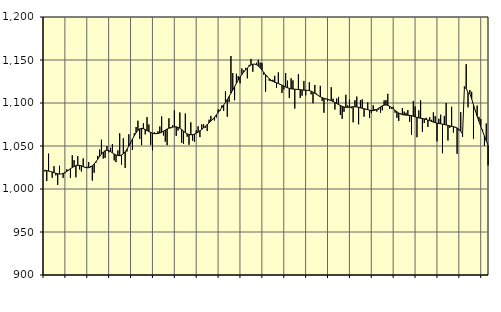
| Category | Piggar | Series 1 |
|---|---|---|
| nan | 1020.4 | 1022.06 |
| 1.0 | 1009.2 | 1021.32 |
| 1.0 | 1041.1 | 1020.83 |
| 1.0 | 1020.2 | 1020.38 |
| 1.0 | 1013.1 | 1019.77 |
| 1.0 | 1026.5 | 1019.11 |
| 1.0 | 1015.9 | 1018.29 |
| 1.0 | 1004.8 | 1017.75 |
| 1.0 | 1027 | 1017.39 |
| 1.0 | 1017.5 | 1017.51 |
| 1.0 | 1012.9 | 1018.12 |
| 1.0 | 1018.3 | 1019.17 |
| nan | 1022.9 | 1020.57 |
| 2.0 | 1021.6 | 1022.12 |
| 2.0 | 1012.8 | 1023.63 |
| 2.0 | 1039.2 | 1024.98 |
| 2.0 | 1033.5 | 1026.19 |
| 2.0 | 1013.6 | 1027.11 |
| 2.0 | 1038.2 | 1027.57 |
| 2.0 | 1022.7 | 1027.54 |
| 2.0 | 1020.4 | 1026.97 |
| 2.0 | 1035.6 | 1026.07 |
| 2.0 | 1024.5 | 1025.22 |
| 2.0 | 1026 | 1024.72 |
| nan | 1031.4 | 1024.78 |
| 3.0 | 1026.6 | 1025.52 |
| 3.0 | 1009.8 | 1026.97 |
| 3.0 | 1018.9 | 1029.09 |
| 3.0 | 1030.4 | 1031.74 |
| 3.0 | 1038.5 | 1034.75 |
| 3.0 | 1045.9 | 1037.85 |
| 3.0 | 1057.3 | 1040.69 |
| 3.0 | 1035.4 | 1042.93 |
| 3.0 | 1036.1 | 1044.4 |
| 3.0 | 1049.9 | 1044.96 |
| 3.0 | 1042.7 | 1044.61 |
| nan | 1047.9 | 1043.51 |
| 4.0 | 1052.2 | 1042.06 |
| 4.0 | 1033.2 | 1040.64 |
| 4.0 | 1031.2 | 1039.55 |
| 4.0 | 1044.9 | 1038.87 |
| 4.0 | 1064.7 | 1038.8 |
| 4.0 | 1028.4 | 1039.47 |
| 4.0 | 1058.9 | 1040.91 |
| 4.0 | 1024.5 | 1043.22 |
| 4.0 | 1043.5 | 1046.31 |
| 4.0 | 1063.6 | 1049.93 |
| 4.0 | 1052.3 | 1053.86 |
| nan | 1045.3 | 1057.98 |
| 5.0 | 1064.8 | 1061.93 |
| 5.0 | 1072.1 | 1065.41 |
| 5.0 | 1079.4 | 1068.15 |
| 5.0 | 1058.2 | 1069.9 |
| 5.0 | 1051 | 1070.49 |
| 5.0 | 1076.4 | 1070.14 |
| 5.0 | 1063.5 | 1069.18 |
| 5.0 | 1083.5 | 1067.98 |
| 5.0 | 1075 | 1066.82 |
| 5.0 | 1051.3 | 1065.77 |
| 5.0 | 1044.9 | 1064.94 |
| nan | 1066 | 1064.41 |
| 6.0 | 1065.1 | 1064.29 |
| 6.0 | 1067.2 | 1064.55 |
| 6.0 | 1072.7 | 1065.09 |
| 6.0 | 1084.4 | 1065.98 |
| 6.0 | 1062.2 | 1067.25 |
| 6.0 | 1055 | 1068.56 |
| 6.0 | 1051 | 1069.75 |
| 6.0 | 1082.2 | 1070.77 |
| 6.0 | 1070.5 | 1071.48 |
| 6.0 | 1074.2 | 1071.95 |
| 6.0 | 1091.4 | 1072.27 |
| nan | 1061.8 | 1072.28 |
| 7.0 | 1068 | 1071.75 |
| 7.0 | 1089 | 1070.7 |
| 7.0 | 1053.7 | 1069.16 |
| 7.0 | 1052.5 | 1067.31 |
| 7.0 | 1087.8 | 1065.48 |
| 7.0 | 1060.7 | 1064.09 |
| 7.0 | 1051.4 | 1063.3 |
| 7.0 | 1077.5 | 1063.04 |
| 7.0 | 1056.2 | 1063.22 |
| 7.0 | 1054.7 | 1063.84 |
| 7.0 | 1068.2 | 1064.83 |
| nan | 1072.9 | 1066.09 |
| 8.0 | 1060.3 | 1067.63 |
| 8.0 | 1075.1 | 1069.3 |
| 8.0 | 1075.2 | 1071.08 |
| 8.0 | 1071.2 | 1072.98 |
| 8.0 | 1067.4 | 1074.9 |
| 8.0 | 1080.6 | 1076.84 |
| 8.0 | 1085 | 1078.91 |
| 8.0 | 1080.2 | 1081.12 |
| 8.0 | 1079.6 | 1083.54 |
| 8.0 | 1083.1 | 1086.17 |
| 8.0 | 1092.7 | 1088.92 |
| nan | 1090.7 | 1091.75 |
| 9.0 | 1097.1 | 1094.65 |
| 9.0 | 1091 | 1097.65 |
| 9.0 | 1113.6 | 1100.73 |
| 9.0 | 1084.1 | 1104.05 |
| 9.0 | 1101.1 | 1107.62 |
| 9.0 | 1154.6 | 1111.34 |
| 9.0 | 1134.7 | 1115.16 |
| 9.0 | 1103.2 | 1119.02 |
| 9.0 | 1134 | 1122.87 |
| 9.0 | 1131.4 | 1126.59 |
| 9.0 | 1122.8 | 1130.04 |
| nan | 1140.1 | 1133.14 |
| 10.0 | 1137.8 | 1135.93 |
| 10.0 | 1140.8 | 1138.5 |
| 10.0 | 1128.7 | 1140.82 |
| 10.0 | 1144.3 | 1142.76 |
| 10.0 | 1151.3 | 1144.25 |
| 10.0 | 1136.4 | 1145.13 |
| 10.0 | 1145.3 | 1145.23 |
| 10.0 | 1146.8 | 1144.57 |
| 10.0 | 1150.2 | 1143.13 |
| 10.0 | 1147.1 | 1140.95 |
| 10.0 | 1146.5 | 1138.34 |
| nan | 1132.9 | 1135.58 |
| 11.0 | 1113.2 | 1132.86 |
| 11.0 | 1131.5 | 1130.35 |
| 11.0 | 1125.9 | 1128.26 |
| 11.0 | 1125.3 | 1126.58 |
| 11.0 | 1127 | 1125.19 |
| 11.0 | 1131.6 | 1124.16 |
| 11.0 | 1117.7 | 1123.41 |
| 11.0 | 1135.6 | 1122.65 |
| 11.0 | 1120.9 | 1121.78 |
| 11.0 | 1111.7 | 1120.8 |
| 11.0 | 1115.8 | 1119.69 |
| nan | 1134.9 | 1118.62 |
| 12.0 | 1126 | 1117.73 |
| 12.0 | 1105.9 | 1117.05 |
| 12.0 | 1128.7 | 1116.51 |
| 12.0 | 1126.3 | 1116.2 |
| 12.0 | 1093.5 | 1116.01 |
| 12.0 | 1115.3 | 1115.86 |
| 12.0 | 1133.4 | 1115.69 |
| 12.0 | 1105.9 | 1115.45 |
| 12.0 | 1108.5 | 1115.15 |
| 12.0 | 1125.6 | 1114.97 |
| 12.0 | 1108.9 | 1114.87 |
| nan | 1114.9 | 1114.73 |
| 13.0 | 1124.1 | 1114.4 |
| 13.0 | 1110 | 1113.71 |
| 13.0 | 1099.7 | 1112.65 |
| 13.0 | 1120.9 | 1111.32 |
| 13.0 | 1111 | 1109.91 |
| 13.0 | 1108.1 | 1108.53 |
| 13.0 | 1119.9 | 1107.24 |
| 13.0 | 1102.4 | 1106.19 |
| 13.0 | 1088.7 | 1105.51 |
| 13.0 | 1104.4 | 1104.96 |
| 13.0 | 1102.2 | 1104.36 |
| nan | 1103.2 | 1103.62 |
| 14.0 | 1118.3 | 1102.69 |
| 14.0 | 1105 | 1101.68 |
| 14.0 | 1092.4 | 1100.64 |
| 14.0 | 1105.2 | 1099.49 |
| 14.0 | 1107.1 | 1098.31 |
| 14.0 | 1086.1 | 1097.18 |
| 14.0 | 1081.6 | 1096.14 |
| 14.0 | 1089.7 | 1095.35 |
| 14.0 | 1109.6 | 1094.99 |
| 14.0 | 1097.3 | 1094.97 |
| 14.0 | 1104 | 1095.18 |
| nan | 1093.9 | 1095.48 |
| 15.0 | 1077.5 | 1095.67 |
| 15.0 | 1103.3 | 1095.62 |
| 15.0 | 1107.5 | 1095.37 |
| 15.0 | 1075.2 | 1094.95 |
| 15.0 | 1103.3 | 1094.4 |
| 15.0 | 1104.3 | 1093.84 |
| 15.0 | 1084.1 | 1093.35 |
| 15.0 | 1092.4 | 1092.85 |
| 15.0 | 1100.7 | 1092.23 |
| 15.0 | 1082.6 | 1091.59 |
| 15.0 | 1088.2 | 1091.17 |
| nan | 1097.4 | 1091.13 |
| 16.0 | 1092.9 | 1091.61 |
| 16.0 | 1090 | 1092.6 |
| 16.0 | 1092.1 | 1093.93 |
| 16.0 | 1088.7 | 1095.39 |
| 16.0 | 1091.4 | 1096.71 |
| 16.0 | 1103 | 1097.54 |
| 16.0 | 1103.4 | 1097.73 |
| 16.0 | 1110.7 | 1097.29 |
| 16.0 | 1093 | 1096.27 |
| 16.0 | 1093.3 | 1094.91 |
| 16.0 | 1095.5 | 1093.32 |
| nan | 1088.8 | 1091.54 |
| 17.0 | 1082.8 | 1089.84 |
| 17.0 | 1079.1 | 1088.4 |
| 17.0 | 1088.1 | 1087.24 |
| 17.0 | 1094.1 | 1086.45 |
| 17.0 | 1090 | 1086.06 |
| 17.0 | 1088.6 | 1085.89 |
| 17.0 | 1091.8 | 1085.78 |
| 17.0 | 1078.3 | 1085.58 |
| 17.0 | 1063.1 | 1085.22 |
| 17.0 | 1102.4 | 1084.69 |
| 17.0 | 1096.1 | 1083.96 |
| nan | 1060.2 | 1083.27 |
| 18.0 | 1091.4 | 1082.69 |
| 18.0 | 1103.1 | 1082.19 |
| 18.0 | 1066.4 | 1081.86 |
| 18.0 | 1076.7 | 1081.53 |
| 18.0 | 1082.8 | 1080.95 |
| 18.0 | 1072.1 | 1080.23 |
| 18.0 | 1083.4 | 1079.45 |
| 18.0 | 1080.4 | 1078.58 |
| 18.0 | 1089.1 | 1077.76 |
| 18.0 | 1084.8 | 1077.02 |
| 18.0 | 1055.4 | 1076.43 |
| nan | 1081.7 | 1076.09 |
| 19.0 | 1086.4 | 1075.82 |
| 19.0 | 1041.6 | 1075.44 |
| 19.0 | 1085 | 1074.98 |
| 19.0 | 1100 | 1074.47 |
| 19.0 | 1056.4 | 1073.96 |
| 19.0 | 1071.2 | 1073.47 |
| 19.0 | 1095.6 | 1072.96 |
| 19.0 | 1065.6 | 1072.49 |
| 19.0 | 1071.4 | 1071.93 |
| 19.0 | 1040.9 | 1070.99 |
| 19.0 | 1068.1 | 1069.47 |
| nan | 1089.4 | 1067.2 |
| 20.0 | 1060.6 | 1063.99 |
| 20.0 | 1119.3 | 1117.18 |
| 20.0 | 1145.1 | 1117.34 |
| 20.0 | 1095 | 1111.62 |
| 20.0 | 1115.1 | 1111.25 |
| 20.0 | 1113 | 1104.7 |
| 20.0 | 1058.3 | 1097.93 |
| 20.0 | 1091.5 | 1091.15 |
| 20.0 | 1097 | 1084.63 |
| 20.0 | 1083.9 | 1078.49 |
| 20.0 | 1081.4 | 1072.73 |
| nan | 1069.1 | 1067.1 |
| 21.0 | 1050.1 | 1061.56 |
| 21.0 | 1076.2 | 1056.18 |
| 21.0 | 1027.5 | 1050.93 |